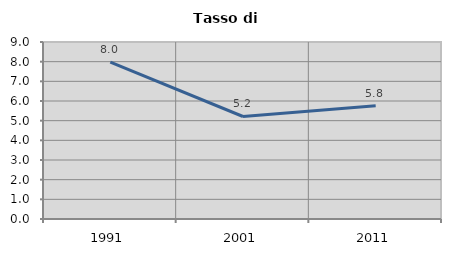
| Category | Tasso di disoccupazione   |
|---|---|
| 1991.0 | 7.975 |
| 2001.0 | 5.212 |
| 2011.0 | 5.763 |